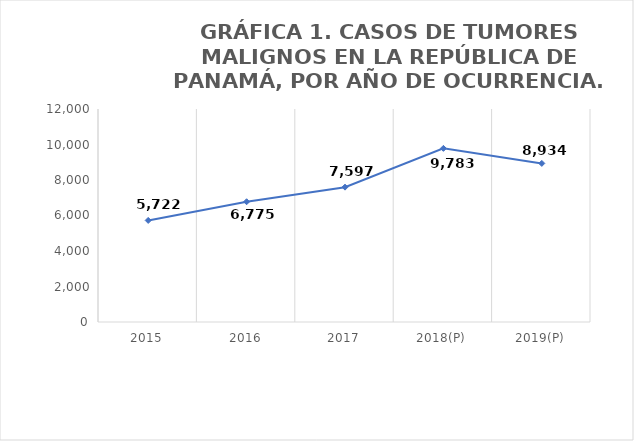
| Category | Total |
|---|---|
| 2015 | 5722 |
| 2016 | 6775 |
| 2017 | 7597 |
| 2018(P) | 9783 |
| 2019(P) | 8934 |